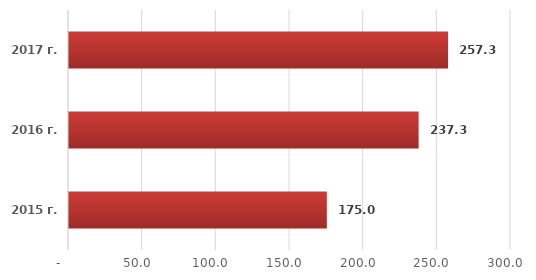
| Category | Series 0 |
|---|---|
| 2015 г. | 175 |
| 2016 г. | 237.3 |
| 2017 г. | 257.3 |